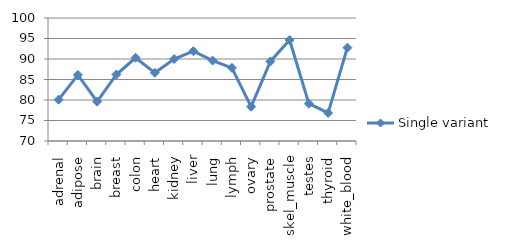
| Category | Single variant |
|---|---|
| adrenal | 80.085 |
| adipose | 86.127 |
| brain | 79.615 |
| breast | 86.219 |
| colon | 90.306 |
| heart | 86.632 |
| kidney | 89.986 |
| liver | 91.913 |
| lung | 89.619 |
| lymph | 87.844 |
| ovary | 78.359 |
| prostate | 89.414 |
| skel_muscle | 94.626 |
| testes | 79.1 |
| thyroid | 76.847 |
| white_blood | 92.767 |